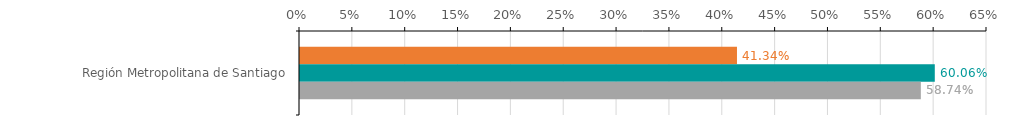
| Category | Numero de operaciones | Monto ($ MM) | Garantia ($ MM) |
|---|---|---|---|
| Región Metropolitana de Santiago | 0.413 | 0.601 | 0.587 |